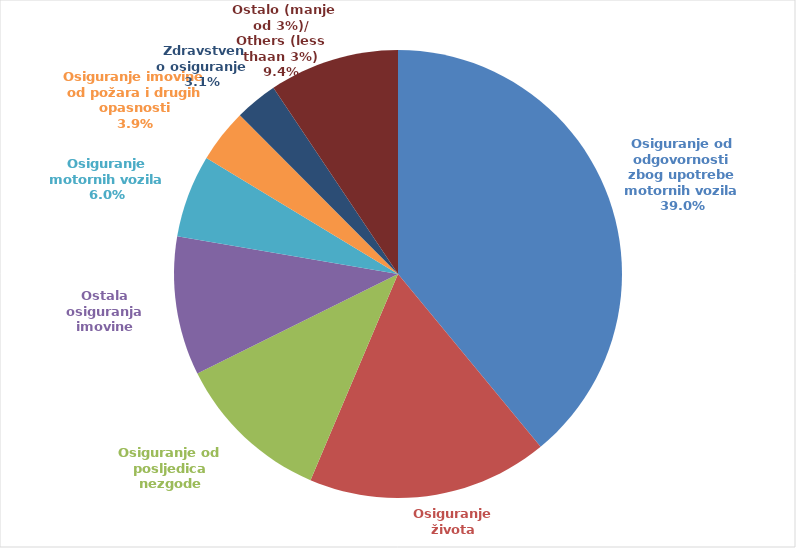
| Category | Series 0 |
|---|---|
| Osiguranje od odgovornosti zbog upotrebe motornih vozila | 35217542.95 |
| Osiguranje života | 15678506.85 |
| Osiguranje od posljedica nezgode | 10184067.12 |
| Ostala osiguranja imovine | 9052194.39 |
| Osiguranje motornih vozila | 5389338.08 |
| Osiguranje imovine od požara i drugih opasnosti | 3485564.14 |
|  Zdravstveno osiguranje | 2781909.36 |
|  Ostalo (manje od 3%)/
Others (less thaan 3%) | 8474378.79 |